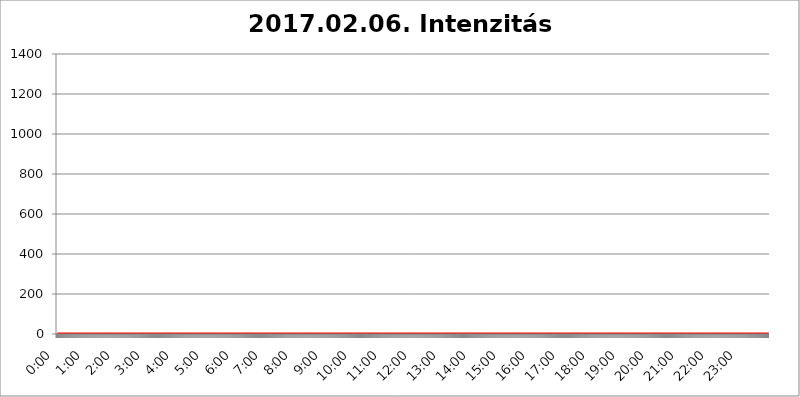
| Category | 2017.02.06. Intenzitás [W/m^2] |
|---|---|
| 0.0 | 0 |
| 0.0006944444444444445 | 0 |
| 0.001388888888888889 | 0 |
| 0.0020833333333333333 | 0 |
| 0.002777777777777778 | 0 |
| 0.003472222222222222 | 0 |
| 0.004166666666666667 | 0 |
| 0.004861111111111111 | 0 |
| 0.005555555555555556 | 0 |
| 0.0062499999999999995 | 0 |
| 0.006944444444444444 | 0 |
| 0.007638888888888889 | 0 |
| 0.008333333333333333 | 0 |
| 0.009027777777777779 | 0 |
| 0.009722222222222222 | 0 |
| 0.010416666666666666 | 0 |
| 0.011111111111111112 | 0 |
| 0.011805555555555555 | 0 |
| 0.012499999999999999 | 0 |
| 0.013194444444444444 | 0 |
| 0.013888888888888888 | 0 |
| 0.014583333333333332 | 0 |
| 0.015277777777777777 | 0 |
| 0.015972222222222224 | 0 |
| 0.016666666666666666 | 0 |
| 0.017361111111111112 | 0 |
| 0.018055555555555557 | 0 |
| 0.01875 | 0 |
| 0.019444444444444445 | 0 |
| 0.02013888888888889 | 0 |
| 0.020833333333333332 | 0 |
| 0.02152777777777778 | 0 |
| 0.022222222222222223 | 0 |
| 0.02291666666666667 | 0 |
| 0.02361111111111111 | 0 |
| 0.024305555555555556 | 0 |
| 0.024999999999999998 | 0 |
| 0.025694444444444447 | 0 |
| 0.02638888888888889 | 0 |
| 0.027083333333333334 | 0 |
| 0.027777777777777776 | 0 |
| 0.02847222222222222 | 0 |
| 0.029166666666666664 | 0 |
| 0.029861111111111113 | 0 |
| 0.030555555555555555 | 0 |
| 0.03125 | 0 |
| 0.03194444444444445 | 0 |
| 0.03263888888888889 | 0 |
| 0.03333333333333333 | 0 |
| 0.034027777777777775 | 0 |
| 0.034722222222222224 | 0 |
| 0.035416666666666666 | 0 |
| 0.036111111111111115 | 0 |
| 0.03680555555555556 | 0 |
| 0.0375 | 0 |
| 0.03819444444444444 | 0 |
| 0.03888888888888889 | 0 |
| 0.03958333333333333 | 0 |
| 0.04027777777777778 | 0 |
| 0.04097222222222222 | 0 |
| 0.041666666666666664 | 0 |
| 0.042361111111111106 | 0 |
| 0.04305555555555556 | 0 |
| 0.043750000000000004 | 0 |
| 0.044444444444444446 | 0 |
| 0.04513888888888889 | 0 |
| 0.04583333333333334 | 0 |
| 0.04652777777777778 | 0 |
| 0.04722222222222222 | 0 |
| 0.04791666666666666 | 0 |
| 0.04861111111111111 | 0 |
| 0.049305555555555554 | 0 |
| 0.049999999999999996 | 0 |
| 0.05069444444444445 | 0 |
| 0.051388888888888894 | 0 |
| 0.052083333333333336 | 0 |
| 0.05277777777777778 | 0 |
| 0.05347222222222222 | 0 |
| 0.05416666666666667 | 0 |
| 0.05486111111111111 | 0 |
| 0.05555555555555555 | 0 |
| 0.05625 | 0 |
| 0.05694444444444444 | 0 |
| 0.057638888888888885 | 0 |
| 0.05833333333333333 | 0 |
| 0.05902777777777778 | 0 |
| 0.059722222222222225 | 0 |
| 0.06041666666666667 | 0 |
| 0.061111111111111116 | 0 |
| 0.06180555555555556 | 0 |
| 0.0625 | 0 |
| 0.06319444444444444 | 0 |
| 0.06388888888888888 | 0 |
| 0.06458333333333334 | 0 |
| 0.06527777777777778 | 0 |
| 0.06597222222222222 | 0 |
| 0.06666666666666667 | 0 |
| 0.06736111111111111 | 0 |
| 0.06805555555555555 | 0 |
| 0.06874999999999999 | 0 |
| 0.06944444444444443 | 0 |
| 0.07013888888888889 | 0 |
| 0.07083333333333333 | 0 |
| 0.07152777777777779 | 0 |
| 0.07222222222222223 | 0 |
| 0.07291666666666667 | 0 |
| 0.07361111111111111 | 0 |
| 0.07430555555555556 | 0 |
| 0.075 | 0 |
| 0.07569444444444444 | 0 |
| 0.0763888888888889 | 0 |
| 0.07708333333333334 | 0 |
| 0.07777777777777778 | 0 |
| 0.07847222222222222 | 0 |
| 0.07916666666666666 | 0 |
| 0.0798611111111111 | 0 |
| 0.08055555555555556 | 0 |
| 0.08125 | 0 |
| 0.08194444444444444 | 0 |
| 0.08263888888888889 | 0 |
| 0.08333333333333333 | 0 |
| 0.08402777777777777 | 0 |
| 0.08472222222222221 | 0 |
| 0.08541666666666665 | 0 |
| 0.08611111111111112 | 0 |
| 0.08680555555555557 | 0 |
| 0.08750000000000001 | 0 |
| 0.08819444444444445 | 0 |
| 0.08888888888888889 | 0 |
| 0.08958333333333333 | 0 |
| 0.09027777777777778 | 0 |
| 0.09097222222222222 | 0 |
| 0.09166666666666667 | 0 |
| 0.09236111111111112 | 0 |
| 0.09305555555555556 | 0 |
| 0.09375 | 0 |
| 0.09444444444444444 | 0 |
| 0.09513888888888888 | 0 |
| 0.09583333333333333 | 0 |
| 0.09652777777777777 | 0 |
| 0.09722222222222222 | 0 |
| 0.09791666666666667 | 0 |
| 0.09861111111111111 | 0 |
| 0.09930555555555555 | 0 |
| 0.09999999999999999 | 0 |
| 0.10069444444444443 | 0 |
| 0.1013888888888889 | 0 |
| 0.10208333333333335 | 0 |
| 0.10277777777777779 | 0 |
| 0.10347222222222223 | 0 |
| 0.10416666666666667 | 0 |
| 0.10486111111111111 | 0 |
| 0.10555555555555556 | 0 |
| 0.10625 | 0 |
| 0.10694444444444444 | 0 |
| 0.1076388888888889 | 0 |
| 0.10833333333333334 | 0 |
| 0.10902777777777778 | 0 |
| 0.10972222222222222 | 0 |
| 0.1111111111111111 | 0 |
| 0.11180555555555556 | 0 |
| 0.11180555555555556 | 0 |
| 0.1125 | 0 |
| 0.11319444444444444 | 0 |
| 0.11388888888888889 | 0 |
| 0.11458333333333333 | 0 |
| 0.11527777777777777 | 0 |
| 0.11597222222222221 | 0 |
| 0.11666666666666665 | 0 |
| 0.1173611111111111 | 0 |
| 0.11805555555555557 | 0 |
| 0.11944444444444445 | 0 |
| 0.12013888888888889 | 0 |
| 0.12083333333333333 | 0 |
| 0.12152777777777778 | 0 |
| 0.12222222222222223 | 0 |
| 0.12291666666666667 | 0 |
| 0.12291666666666667 | 0 |
| 0.12361111111111112 | 0 |
| 0.12430555555555556 | 0 |
| 0.125 | 0 |
| 0.12569444444444444 | 0 |
| 0.12638888888888888 | 0 |
| 0.12708333333333333 | 0 |
| 0.16875 | 0 |
| 0.12847222222222224 | 0 |
| 0.12916666666666668 | 0 |
| 0.12986111111111112 | 0 |
| 0.13055555555555556 | 0 |
| 0.13125 | 0 |
| 0.13194444444444445 | 0 |
| 0.1326388888888889 | 0 |
| 0.13333333333333333 | 0 |
| 0.13402777777777777 | 0 |
| 0.13402777777777777 | 0 |
| 0.13472222222222222 | 0 |
| 0.13541666666666666 | 0 |
| 0.1361111111111111 | 0 |
| 0.13749999999999998 | 0 |
| 0.13819444444444443 | 0 |
| 0.1388888888888889 | 0 |
| 0.13958333333333334 | 0 |
| 0.14027777777777778 | 0 |
| 0.14097222222222222 | 0 |
| 0.14166666666666666 | 0 |
| 0.1423611111111111 | 0 |
| 0.14305555555555557 | 0 |
| 0.14375000000000002 | 0 |
| 0.14444444444444446 | 0 |
| 0.1451388888888889 | 0 |
| 0.1451388888888889 | 0 |
| 0.14652777777777778 | 0 |
| 0.14722222222222223 | 0 |
| 0.14791666666666667 | 0 |
| 0.1486111111111111 | 0 |
| 0.14930555555555555 | 0 |
| 0.15 | 0 |
| 0.15069444444444444 | 0 |
| 0.15138888888888888 | 0 |
| 0.15208333333333332 | 0 |
| 0.15277777777777776 | 0 |
| 0.15347222222222223 | 0 |
| 0.15416666666666667 | 0 |
| 0.15486111111111112 | 0 |
| 0.15555555555555556 | 0 |
| 0.15625 | 0 |
| 0.15694444444444444 | 0 |
| 0.15763888888888888 | 0 |
| 0.15833333333333333 | 0 |
| 0.15902777777777777 | 0 |
| 0.15972222222222224 | 0 |
| 0.16041666666666668 | 0 |
| 0.16111111111111112 | 0 |
| 0.16180555555555556 | 0 |
| 0.1625 | 0 |
| 0.16319444444444445 | 0 |
| 0.1638888888888889 | 0 |
| 0.16458333333333333 | 0 |
| 0.16527777777777777 | 0 |
| 0.16597222222222222 | 0 |
| 0.16666666666666666 | 0 |
| 0.1673611111111111 | 0 |
| 0.16805555555555554 | 0 |
| 0.16874999999999998 | 0 |
| 0.16944444444444443 | 0 |
| 0.17013888888888887 | 0 |
| 0.1708333333333333 | 0 |
| 0.17152777777777775 | 0 |
| 0.17222222222222225 | 0 |
| 0.1729166666666667 | 0 |
| 0.17361111111111113 | 0 |
| 0.17430555555555557 | 0 |
| 0.17500000000000002 | 0 |
| 0.17569444444444446 | 0 |
| 0.1763888888888889 | 0 |
| 0.17708333333333334 | 0 |
| 0.17777777777777778 | 0 |
| 0.17847222222222223 | 0 |
| 0.17916666666666667 | 0 |
| 0.1798611111111111 | 0 |
| 0.18055555555555555 | 0 |
| 0.18125 | 0 |
| 0.18194444444444444 | 0 |
| 0.1826388888888889 | 0 |
| 0.18333333333333335 | 0 |
| 0.1840277777777778 | 0 |
| 0.18472222222222223 | 0 |
| 0.18541666666666667 | 0 |
| 0.18611111111111112 | 0 |
| 0.18680555555555556 | 0 |
| 0.1875 | 0 |
| 0.18819444444444444 | 0 |
| 0.18888888888888888 | 0 |
| 0.18958333333333333 | 0 |
| 0.19027777777777777 | 0 |
| 0.1909722222222222 | 0 |
| 0.19166666666666665 | 0 |
| 0.19236111111111112 | 0 |
| 0.19305555555555554 | 0 |
| 0.19375 | 0 |
| 0.19444444444444445 | 0 |
| 0.1951388888888889 | 0 |
| 0.19583333333333333 | 0 |
| 0.19652777777777777 | 0 |
| 0.19722222222222222 | 0 |
| 0.19791666666666666 | 0 |
| 0.1986111111111111 | 0 |
| 0.19930555555555554 | 0 |
| 0.19999999999999998 | 0 |
| 0.20069444444444443 | 0 |
| 0.20138888888888887 | 0 |
| 0.2020833333333333 | 0 |
| 0.2027777777777778 | 0 |
| 0.2034722222222222 | 0 |
| 0.2041666666666667 | 0 |
| 0.20486111111111113 | 0 |
| 0.20555555555555557 | 0 |
| 0.20625000000000002 | 0 |
| 0.20694444444444446 | 0 |
| 0.2076388888888889 | 0 |
| 0.20833333333333334 | 0 |
| 0.20902777777777778 | 0 |
| 0.20972222222222223 | 0 |
| 0.21041666666666667 | 0 |
| 0.2111111111111111 | 0 |
| 0.21180555555555555 | 0 |
| 0.2125 | 0 |
| 0.21319444444444444 | 0 |
| 0.2138888888888889 | 0 |
| 0.21458333333333335 | 0 |
| 0.2152777777777778 | 0 |
| 0.21597222222222223 | 0 |
| 0.21666666666666667 | 0 |
| 0.21736111111111112 | 0 |
| 0.21805555555555556 | 0 |
| 0.21875 | 0 |
| 0.21944444444444444 | 0 |
| 0.22013888888888888 | 0 |
| 0.22083333333333333 | 0 |
| 0.22152777777777777 | 0 |
| 0.2222222222222222 | 0 |
| 0.22291666666666665 | 0 |
| 0.2236111111111111 | 0 |
| 0.22430555555555556 | 0 |
| 0.225 | 0 |
| 0.22569444444444445 | 0 |
| 0.2263888888888889 | 0 |
| 0.22708333333333333 | 0 |
| 0.22777777777777777 | 0 |
| 0.22847222222222222 | 0 |
| 0.22916666666666666 | 0 |
| 0.2298611111111111 | 0 |
| 0.23055555555555554 | 0 |
| 0.23124999999999998 | 0 |
| 0.23194444444444443 | 0 |
| 0.23263888888888887 | 0 |
| 0.2333333333333333 | 0 |
| 0.2340277777777778 | 0 |
| 0.2347222222222222 | 0 |
| 0.2354166666666667 | 0 |
| 0.23611111111111113 | 0 |
| 0.23680555555555557 | 0 |
| 0.23750000000000002 | 0 |
| 0.23819444444444446 | 0 |
| 0.2388888888888889 | 0 |
| 0.23958333333333334 | 0 |
| 0.24027777777777778 | 0 |
| 0.24097222222222223 | 0 |
| 0.24166666666666667 | 0 |
| 0.2423611111111111 | 0 |
| 0.24305555555555555 | 0 |
| 0.24375 | 0 |
| 0.24444444444444446 | 0 |
| 0.24513888888888888 | 0 |
| 0.24583333333333335 | 0 |
| 0.2465277777777778 | 0 |
| 0.24722222222222223 | 0 |
| 0.24791666666666667 | 0 |
| 0.24861111111111112 | 0 |
| 0.24930555555555556 | 0 |
| 0.25 | 0 |
| 0.25069444444444444 | 0 |
| 0.2513888888888889 | 0 |
| 0.2520833333333333 | 0 |
| 0.25277777777777777 | 0 |
| 0.2534722222222222 | 0 |
| 0.25416666666666665 | 0 |
| 0.2548611111111111 | 0 |
| 0.2555555555555556 | 0 |
| 0.25625000000000003 | 0 |
| 0.2569444444444445 | 0 |
| 0.2576388888888889 | 0 |
| 0.25833333333333336 | 0 |
| 0.2590277777777778 | 0 |
| 0.25972222222222224 | 0 |
| 0.2604166666666667 | 0 |
| 0.2611111111111111 | 0 |
| 0.26180555555555557 | 0 |
| 0.2625 | 0 |
| 0.26319444444444445 | 0 |
| 0.2638888888888889 | 0 |
| 0.26458333333333334 | 0 |
| 0.2652777777777778 | 0 |
| 0.2659722222222222 | 0 |
| 0.26666666666666666 | 0 |
| 0.2673611111111111 | 0 |
| 0.26805555555555555 | 0 |
| 0.26875 | 0 |
| 0.26944444444444443 | 0 |
| 0.2701388888888889 | 0 |
| 0.2708333333333333 | 0 |
| 0.27152777777777776 | 0 |
| 0.2722222222222222 | 0 |
| 0.27291666666666664 | 0 |
| 0.2736111111111111 | 0 |
| 0.2743055555555555 | 0 |
| 0.27499999999999997 | 0 |
| 0.27569444444444446 | 0 |
| 0.27638888888888885 | 0 |
| 0.27708333333333335 | 0 |
| 0.2777777777777778 | 0 |
| 0.27847222222222223 | 0 |
| 0.2791666666666667 | 0 |
| 0.2798611111111111 | 0 |
| 0.28055555555555556 | 0 |
| 0.28125 | 0 |
| 0.28194444444444444 | 0 |
| 0.2826388888888889 | 0 |
| 0.2833333333333333 | 0 |
| 0.28402777777777777 | 0 |
| 0.2847222222222222 | 0 |
| 0.28541666666666665 | 0 |
| 0.28611111111111115 | 0 |
| 0.28680555555555554 | 0 |
| 0.28750000000000003 | 0 |
| 0.2881944444444445 | 0 |
| 0.2888888888888889 | 0 |
| 0.28958333333333336 | 0 |
| 0.2902777777777778 | 0 |
| 0.29097222222222224 | 0 |
| 0.2916666666666667 | 0 |
| 0.2923611111111111 | 0 |
| 0.29305555555555557 | 0 |
| 0.29375 | 0 |
| 0.29444444444444445 | 0 |
| 0.2951388888888889 | 0 |
| 0.29583333333333334 | 0 |
| 0.2965277777777778 | 0 |
| 0.2972222222222222 | 0 |
| 0.29791666666666666 | 0 |
| 0.2986111111111111 | 0 |
| 0.29930555555555555 | 0 |
| 0.3 | 0 |
| 0.30069444444444443 | 0 |
| 0.3013888888888889 | 0 |
| 0.3020833333333333 | 0 |
| 0.30277777777777776 | 0 |
| 0.3034722222222222 | 0 |
| 0.30416666666666664 | 0 |
| 0.3048611111111111 | 0 |
| 0.3055555555555555 | 0 |
| 0.30624999999999997 | 0 |
| 0.3069444444444444 | 0 |
| 0.3076388888888889 | 0 |
| 0.30833333333333335 | 0 |
| 0.3090277777777778 | 0 |
| 0.30972222222222223 | 0 |
| 0.3104166666666667 | 0 |
| 0.3111111111111111 | 0 |
| 0.31180555555555556 | 0 |
| 0.3125 | 0 |
| 0.31319444444444444 | 0 |
| 0.3138888888888889 | 0 |
| 0.3145833333333333 | 0 |
| 0.31527777777777777 | 0 |
| 0.3159722222222222 | 0 |
| 0.31666666666666665 | 0 |
| 0.31736111111111115 | 0 |
| 0.31805555555555554 | 0 |
| 0.31875000000000003 | 0 |
| 0.3194444444444445 | 0 |
| 0.3201388888888889 | 0 |
| 0.32083333333333336 | 0 |
| 0.3215277777777778 | 0 |
| 0.32222222222222224 | 0 |
| 0.3229166666666667 | 0 |
| 0.3236111111111111 | 0 |
| 0.32430555555555557 | 0 |
| 0.325 | 0 |
| 0.32569444444444445 | 0 |
| 0.3263888888888889 | 0 |
| 0.32708333333333334 | 0 |
| 0.3277777777777778 | 0 |
| 0.3284722222222222 | 0 |
| 0.32916666666666666 | 0 |
| 0.3298611111111111 | 0 |
| 0.33055555555555555 | 0 |
| 0.33125 | 0 |
| 0.33194444444444443 | 0 |
| 0.3326388888888889 | 0 |
| 0.3333333333333333 | 0 |
| 0.3340277777777778 | 0 |
| 0.3347222222222222 | 0 |
| 0.3354166666666667 | 0 |
| 0.3361111111111111 | 0 |
| 0.3368055555555556 | 0 |
| 0.33749999999999997 | 0 |
| 0.33819444444444446 | 0 |
| 0.33888888888888885 | 0 |
| 0.33958333333333335 | 0 |
| 0.34027777777777773 | 0 |
| 0.34097222222222223 | 0 |
| 0.3416666666666666 | 0 |
| 0.3423611111111111 | 0 |
| 0.3430555555555555 | 0 |
| 0.34375 | 0 |
| 0.3444444444444445 | 0 |
| 0.3451388888888889 | 0 |
| 0.3458333333333334 | 0 |
| 0.34652777777777777 | 0 |
| 0.34722222222222227 | 0 |
| 0.34791666666666665 | 0 |
| 0.34861111111111115 | 0 |
| 0.34930555555555554 | 0 |
| 0.35000000000000003 | 0 |
| 0.3506944444444444 | 0 |
| 0.3513888888888889 | 0 |
| 0.3520833333333333 | 0 |
| 0.3527777777777778 | 0 |
| 0.3534722222222222 | 0 |
| 0.3541666666666667 | 0 |
| 0.3548611111111111 | 0 |
| 0.35555555555555557 | 0 |
| 0.35625 | 0 |
| 0.35694444444444445 | 0 |
| 0.3576388888888889 | 0 |
| 0.35833333333333334 | 0 |
| 0.3590277777777778 | 0 |
| 0.3597222222222222 | 0 |
| 0.36041666666666666 | 0 |
| 0.3611111111111111 | 0 |
| 0.36180555555555555 | 0 |
| 0.3625 | 0 |
| 0.36319444444444443 | 0 |
| 0.3638888888888889 | 0 |
| 0.3645833333333333 | 0 |
| 0.3652777777777778 | 0 |
| 0.3659722222222222 | 0 |
| 0.3666666666666667 | 0 |
| 0.3673611111111111 | 0 |
| 0.3680555555555556 | 0 |
| 0.36874999999999997 | 0 |
| 0.36944444444444446 | 0 |
| 0.37013888888888885 | 0 |
| 0.37083333333333335 | 0 |
| 0.37152777777777773 | 0 |
| 0.37222222222222223 | 0 |
| 0.3729166666666666 | 0 |
| 0.3736111111111111 | 0 |
| 0.3743055555555555 | 0 |
| 0.375 | 0 |
| 0.3756944444444445 | 0 |
| 0.3763888888888889 | 0 |
| 0.3770833333333334 | 0 |
| 0.37777777777777777 | 0 |
| 0.37847222222222227 | 0 |
| 0.37916666666666665 | 0 |
| 0.37986111111111115 | 0 |
| 0.38055555555555554 | 0 |
| 0.38125000000000003 | 0 |
| 0.3819444444444444 | 0 |
| 0.3826388888888889 | 0 |
| 0.3833333333333333 | 0 |
| 0.3840277777777778 | 0 |
| 0.3847222222222222 | 0 |
| 0.3854166666666667 | 0 |
| 0.3861111111111111 | 0 |
| 0.38680555555555557 | 0 |
| 0.3875 | 0 |
| 0.38819444444444445 | 0 |
| 0.3888888888888889 | 0 |
| 0.38958333333333334 | 0 |
| 0.3902777777777778 | 0 |
| 0.3909722222222222 | 0 |
| 0.39166666666666666 | 0 |
| 0.3923611111111111 | 0 |
| 0.39305555555555555 | 0 |
| 0.39375 | 0 |
| 0.39444444444444443 | 0 |
| 0.3951388888888889 | 0 |
| 0.3958333333333333 | 0 |
| 0.3965277777777778 | 0 |
| 0.3972222222222222 | 0 |
| 0.3979166666666667 | 0 |
| 0.3986111111111111 | 0 |
| 0.3993055555555556 | 0 |
| 0.39999999999999997 | 0 |
| 0.40069444444444446 | 0 |
| 0.40138888888888885 | 0 |
| 0.40208333333333335 | 0 |
| 0.40277777777777773 | 0 |
| 0.40347222222222223 | 0 |
| 0.4041666666666666 | 0 |
| 0.4048611111111111 | 0 |
| 0.4055555555555555 | 0 |
| 0.40625 | 0 |
| 0.4069444444444445 | 0 |
| 0.4076388888888889 | 0 |
| 0.4083333333333334 | 0 |
| 0.40902777777777777 | 0 |
| 0.40972222222222227 | 0 |
| 0.41041666666666665 | 0 |
| 0.41111111111111115 | 0 |
| 0.41180555555555554 | 0 |
| 0.41250000000000003 | 0 |
| 0.4131944444444444 | 0 |
| 0.4138888888888889 | 0 |
| 0.4145833333333333 | 0 |
| 0.4152777777777778 | 0 |
| 0.4159722222222222 | 0 |
| 0.4166666666666667 | 0 |
| 0.4173611111111111 | 0 |
| 0.41805555555555557 | 0 |
| 0.41875 | 0 |
| 0.41944444444444445 | 0 |
| 0.4201388888888889 | 0 |
| 0.42083333333333334 | 0 |
| 0.4215277777777778 | 0 |
| 0.4222222222222222 | 0 |
| 0.42291666666666666 | 0 |
| 0.4236111111111111 | 0 |
| 0.42430555555555555 | 0 |
| 0.425 | 0 |
| 0.42569444444444443 | 0 |
| 0.4263888888888889 | 0 |
| 0.4270833333333333 | 0 |
| 0.4277777777777778 | 0 |
| 0.4284722222222222 | 0 |
| 0.4291666666666667 | 0 |
| 0.4298611111111111 | 0 |
| 0.4305555555555556 | 0 |
| 0.43124999999999997 | 0 |
| 0.43194444444444446 | 0 |
| 0.43263888888888885 | 0 |
| 0.43333333333333335 | 0 |
| 0.43402777777777773 | 0 |
| 0.43472222222222223 | 0 |
| 0.4354166666666666 | 0 |
| 0.4361111111111111 | 0 |
| 0.4368055555555555 | 0 |
| 0.4375 | 0 |
| 0.4381944444444445 | 0 |
| 0.4388888888888889 | 0 |
| 0.4395833333333334 | 0 |
| 0.44027777777777777 | 0 |
| 0.44097222222222227 | 0 |
| 0.44166666666666665 | 0 |
| 0.44236111111111115 | 0 |
| 0.44305555555555554 | 0 |
| 0.44375000000000003 | 0 |
| 0.4444444444444444 | 0 |
| 0.4451388888888889 | 0 |
| 0.4458333333333333 | 0 |
| 0.4465277777777778 | 0 |
| 0.4472222222222222 | 0 |
| 0.4479166666666667 | 0 |
| 0.4486111111111111 | 0 |
| 0.44930555555555557 | 0 |
| 0.45 | 0 |
| 0.45069444444444445 | 0 |
| 0.4513888888888889 | 0 |
| 0.45208333333333334 | 0 |
| 0.4527777777777778 | 0 |
| 0.4534722222222222 | 0 |
| 0.45416666666666666 | 0 |
| 0.4548611111111111 | 0 |
| 0.45555555555555555 | 0 |
| 0.45625 | 0 |
| 0.45694444444444443 | 0 |
| 0.4576388888888889 | 0 |
| 0.4583333333333333 | 0 |
| 0.4590277777777778 | 0 |
| 0.4597222222222222 | 0 |
| 0.4604166666666667 | 0 |
| 0.4611111111111111 | 0 |
| 0.4618055555555556 | 0 |
| 0.46249999999999997 | 0 |
| 0.46319444444444446 | 0 |
| 0.46388888888888885 | 0 |
| 0.46458333333333335 | 0 |
| 0.46527777777777773 | 0 |
| 0.46597222222222223 | 0 |
| 0.4666666666666666 | 0 |
| 0.4673611111111111 | 0 |
| 0.4680555555555555 | 0 |
| 0.46875 | 0 |
| 0.4694444444444445 | 0 |
| 0.4701388888888889 | 0 |
| 0.4708333333333334 | 0 |
| 0.47152777777777777 | 0 |
| 0.47222222222222227 | 0 |
| 0.47291666666666665 | 0 |
| 0.47361111111111115 | 0 |
| 0.47430555555555554 | 0 |
| 0.47500000000000003 | 0 |
| 0.4756944444444444 | 0 |
| 0.4763888888888889 | 0 |
| 0.4770833333333333 | 0 |
| 0.4777777777777778 | 0 |
| 0.4784722222222222 | 0 |
| 0.4791666666666667 | 0 |
| 0.4798611111111111 | 0 |
| 0.48055555555555557 | 0 |
| 0.48125 | 0 |
| 0.48194444444444445 | 0 |
| 0.4826388888888889 | 0 |
| 0.48333333333333334 | 0 |
| 0.4840277777777778 | 0 |
| 0.4847222222222222 | 0 |
| 0.48541666666666666 | 0 |
| 0.4861111111111111 | 0 |
| 0.48680555555555555 | 0 |
| 0.4875 | 0 |
| 0.48819444444444443 | 0 |
| 0.4888888888888889 | 0 |
| 0.4895833333333333 | 0 |
| 0.4902777777777778 | 0 |
| 0.4909722222222222 | 0 |
| 0.4916666666666667 | 0 |
| 0.4923611111111111 | 0 |
| 0.4930555555555556 | 0 |
| 0.49374999999999997 | 0 |
| 0.49444444444444446 | 0 |
| 0.49513888888888885 | 0 |
| 0.49583333333333335 | 0 |
| 0.49652777777777773 | 0 |
| 0.49722222222222223 | 0 |
| 0.4979166666666666 | 0 |
| 0.4986111111111111 | 0 |
| 0.4993055555555555 | 0 |
| 0.5 | 0 |
| 0.5006944444444444 | 0 |
| 0.5013888888888889 | 0 |
| 0.5020833333333333 | 0 |
| 0.5027777777777778 | 0 |
| 0.5034722222222222 | 0 |
| 0.5041666666666667 | 0 |
| 0.5048611111111111 | 0 |
| 0.5055555555555555 | 0 |
| 0.50625 | 0 |
| 0.5069444444444444 | 0 |
| 0.5076388888888889 | 0 |
| 0.5083333333333333 | 0 |
| 0.5090277777777777 | 0 |
| 0.5097222222222222 | 0 |
| 0.5104166666666666 | 0 |
| 0.5111111111111112 | 0 |
| 0.5118055555555555 | 0 |
| 0.5125000000000001 | 0 |
| 0.5131944444444444 | 0 |
| 0.513888888888889 | 0 |
| 0.5145833333333333 | 0 |
| 0.5152777777777778 | 0 |
| 0.5159722222222222 | 0 |
| 0.5166666666666667 | 0 |
| 0.517361111111111 | 0 |
| 0.5180555555555556 | 0 |
| 0.5187499999999999 | 0 |
| 0.5194444444444445 | 0 |
| 0.5201388888888888 | 0 |
| 0.5208333333333334 | 0 |
| 0.5215277777777778 | 0 |
| 0.5222222222222223 | 0 |
| 0.5229166666666667 | 0 |
| 0.5236111111111111 | 0 |
| 0.5243055555555556 | 0 |
| 0.525 | 0 |
| 0.5256944444444445 | 0 |
| 0.5263888888888889 | 0 |
| 0.5270833333333333 | 0 |
| 0.5277777777777778 | 0 |
| 0.5284722222222222 | 0 |
| 0.5291666666666667 | 0 |
| 0.5298611111111111 | 0 |
| 0.5305555555555556 | 0 |
| 0.53125 | 0 |
| 0.5319444444444444 | 0 |
| 0.5326388888888889 | 0 |
| 0.5333333333333333 | 0 |
| 0.5340277777777778 | 0 |
| 0.5347222222222222 | 0 |
| 0.5354166666666667 | 0 |
| 0.5361111111111111 | 0 |
| 0.5368055555555555 | 0 |
| 0.5375 | 0 |
| 0.5381944444444444 | 0 |
| 0.5388888888888889 | 0 |
| 0.5395833333333333 | 0 |
| 0.5402777777777777 | 0 |
| 0.5409722222222222 | 0 |
| 0.5416666666666666 | 0 |
| 0.5423611111111112 | 0 |
| 0.5430555555555555 | 0 |
| 0.5437500000000001 | 0 |
| 0.5444444444444444 | 0 |
| 0.545138888888889 | 0 |
| 0.5458333333333333 | 0 |
| 0.5465277777777778 | 0 |
| 0.5472222222222222 | 0 |
| 0.5479166666666667 | 0 |
| 0.548611111111111 | 0 |
| 0.5493055555555556 | 0 |
| 0.5499999999999999 | 0 |
| 0.5506944444444445 | 0 |
| 0.5513888888888888 | 0 |
| 0.5520833333333334 | 0 |
| 0.5527777777777778 | 0 |
| 0.5534722222222223 | 0 |
| 0.5541666666666667 | 0 |
| 0.5548611111111111 | 0 |
| 0.5555555555555556 | 0 |
| 0.55625 | 0 |
| 0.5569444444444445 | 0 |
| 0.5576388888888889 | 0 |
| 0.5583333333333333 | 0 |
| 0.5590277777777778 | 0 |
| 0.5597222222222222 | 0 |
| 0.5604166666666667 | 0 |
| 0.5611111111111111 | 0 |
| 0.5618055555555556 | 0 |
| 0.5625 | 0 |
| 0.5631944444444444 | 0 |
| 0.5638888888888889 | 0 |
| 0.5645833333333333 | 0 |
| 0.5652777777777778 | 0 |
| 0.5659722222222222 | 0 |
| 0.5666666666666667 | 0 |
| 0.5673611111111111 | 0 |
| 0.5680555555555555 | 0 |
| 0.56875 | 0 |
| 0.5694444444444444 | 0 |
| 0.5701388888888889 | 0 |
| 0.5708333333333333 | 0 |
| 0.5715277777777777 | 0 |
| 0.5722222222222222 | 0 |
| 0.5729166666666666 | 0 |
| 0.5736111111111112 | 0 |
| 0.5743055555555555 | 0 |
| 0.5750000000000001 | 0 |
| 0.5756944444444444 | 0 |
| 0.576388888888889 | 0 |
| 0.5770833333333333 | 0 |
| 0.5777777777777778 | 0 |
| 0.5784722222222222 | 0 |
| 0.5791666666666667 | 0 |
| 0.579861111111111 | 0 |
| 0.5805555555555556 | 0 |
| 0.5812499999999999 | 0 |
| 0.5819444444444445 | 0 |
| 0.5826388888888888 | 0 |
| 0.5833333333333334 | 0 |
| 0.5840277777777778 | 0 |
| 0.5847222222222223 | 0 |
| 0.5854166666666667 | 0 |
| 0.5861111111111111 | 0 |
| 0.5868055555555556 | 0 |
| 0.5875 | 0 |
| 0.5881944444444445 | 0 |
| 0.5888888888888889 | 0 |
| 0.5895833333333333 | 0 |
| 0.5902777777777778 | 0 |
| 0.5909722222222222 | 0 |
| 0.5916666666666667 | 0 |
| 0.5923611111111111 | 0 |
| 0.5930555555555556 | 0 |
| 0.59375 | 0 |
| 0.5944444444444444 | 0 |
| 0.5951388888888889 | 0 |
| 0.5958333333333333 | 0 |
| 0.5965277777777778 | 0 |
| 0.5972222222222222 | 0 |
| 0.5979166666666667 | 0 |
| 0.5986111111111111 | 0 |
| 0.5993055555555555 | 0 |
| 0.6 | 0 |
| 0.6006944444444444 | 0 |
| 0.6013888888888889 | 0 |
| 0.6020833333333333 | 0 |
| 0.6027777777777777 | 0 |
| 0.6034722222222222 | 0 |
| 0.6041666666666666 | 0 |
| 0.6048611111111112 | 0 |
| 0.6055555555555555 | 0 |
| 0.6062500000000001 | 0 |
| 0.6069444444444444 | 0 |
| 0.607638888888889 | 0 |
| 0.6083333333333333 | 0 |
| 0.6090277777777778 | 0 |
| 0.6097222222222222 | 0 |
| 0.6104166666666667 | 0 |
| 0.611111111111111 | 0 |
| 0.6118055555555556 | 0 |
| 0.6124999999999999 | 0 |
| 0.6131944444444445 | 0 |
| 0.6138888888888888 | 0 |
| 0.6145833333333334 | 0 |
| 0.6152777777777778 | 0 |
| 0.6159722222222223 | 0 |
| 0.6166666666666667 | 0 |
| 0.6173611111111111 | 0 |
| 0.6180555555555556 | 0 |
| 0.61875 | 0 |
| 0.6194444444444445 | 0 |
| 0.6201388888888889 | 0 |
| 0.6208333333333333 | 0 |
| 0.6215277777777778 | 0 |
| 0.6222222222222222 | 0 |
| 0.6229166666666667 | 0 |
| 0.6236111111111111 | 0 |
| 0.6243055555555556 | 0 |
| 0.625 | 0 |
| 0.6256944444444444 | 0 |
| 0.6263888888888889 | 0 |
| 0.6270833333333333 | 0 |
| 0.6277777777777778 | 0 |
| 0.6284722222222222 | 0 |
| 0.6291666666666667 | 0 |
| 0.6298611111111111 | 0 |
| 0.6305555555555555 | 0 |
| 0.63125 | 0 |
| 0.6319444444444444 | 0 |
| 0.6326388888888889 | 0 |
| 0.6333333333333333 | 0 |
| 0.6340277777777777 | 0 |
| 0.6347222222222222 | 0 |
| 0.6354166666666666 | 0 |
| 0.6361111111111112 | 0 |
| 0.6368055555555555 | 0 |
| 0.6375000000000001 | 0 |
| 0.6381944444444444 | 0 |
| 0.638888888888889 | 0 |
| 0.6395833333333333 | 0 |
| 0.6402777777777778 | 0 |
| 0.6409722222222222 | 0 |
| 0.6416666666666667 | 0 |
| 0.642361111111111 | 0 |
| 0.6430555555555556 | 0 |
| 0.6437499999999999 | 0 |
| 0.6444444444444445 | 0 |
| 0.6451388888888888 | 0 |
| 0.6458333333333334 | 0 |
| 0.6465277777777778 | 0 |
| 0.6472222222222223 | 0 |
| 0.6479166666666667 | 0 |
| 0.6486111111111111 | 0 |
| 0.6493055555555556 | 0 |
| 0.65 | 0 |
| 0.6506944444444445 | 0 |
| 0.6513888888888889 | 0 |
| 0.6520833333333333 | 0 |
| 0.6527777777777778 | 0 |
| 0.6534722222222222 | 0 |
| 0.6541666666666667 | 0 |
| 0.6548611111111111 | 0 |
| 0.6555555555555556 | 0 |
| 0.65625 | 0 |
| 0.6569444444444444 | 0 |
| 0.6576388888888889 | 0 |
| 0.6583333333333333 | 0 |
| 0.6590277777777778 | 0 |
| 0.6597222222222222 | 0 |
| 0.6604166666666667 | 0 |
| 0.6611111111111111 | 0 |
| 0.6618055555555555 | 0 |
| 0.6625 | 0 |
| 0.6631944444444444 | 0 |
| 0.6638888888888889 | 0 |
| 0.6645833333333333 | 0 |
| 0.6652777777777777 | 0 |
| 0.6659722222222222 | 0 |
| 0.6666666666666666 | 0 |
| 0.6673611111111111 | 0 |
| 0.6680555555555556 | 0 |
| 0.6687500000000001 | 0 |
| 0.6694444444444444 | 0 |
| 0.6701388888888888 | 0 |
| 0.6708333333333334 | 0 |
| 0.6715277777777778 | 0 |
| 0.6722222222222222 | 0 |
| 0.6729166666666666 | 0 |
| 0.6736111111111112 | 0 |
| 0.6743055555555556 | 0 |
| 0.6749999999999999 | 0 |
| 0.6756944444444444 | 0 |
| 0.6763888888888889 | 0 |
| 0.6770833333333334 | 0 |
| 0.6777777777777777 | 0 |
| 0.6784722222222223 | 0 |
| 0.6791666666666667 | 0 |
| 0.6798611111111111 | 0 |
| 0.6805555555555555 | 0 |
| 0.68125 | 0 |
| 0.6819444444444445 | 0 |
| 0.6826388888888889 | 0 |
| 0.6833333333333332 | 0 |
| 0.6840277777777778 | 0 |
| 0.6847222222222222 | 0 |
| 0.6854166666666667 | 0 |
| 0.686111111111111 | 0 |
| 0.6868055555555556 | 0 |
| 0.6875 | 0 |
| 0.6881944444444444 | 0 |
| 0.688888888888889 | 0 |
| 0.6895833333333333 | 0 |
| 0.6902777777777778 | 0 |
| 0.6909722222222222 | 0 |
| 0.6916666666666668 | 0 |
| 0.6923611111111111 | 0 |
| 0.6930555555555555 | 0 |
| 0.69375 | 0 |
| 0.6944444444444445 | 0 |
| 0.6951388888888889 | 0 |
| 0.6958333333333333 | 0 |
| 0.6965277777777777 | 0 |
| 0.6972222222222223 | 0 |
| 0.6979166666666666 | 0 |
| 0.6986111111111111 | 0 |
| 0.6993055555555556 | 0 |
| 0.7000000000000001 | 0 |
| 0.7006944444444444 | 0 |
| 0.7013888888888888 | 0 |
| 0.7020833333333334 | 0 |
| 0.7027777777777778 | 0 |
| 0.7034722222222222 | 0 |
| 0.7041666666666666 | 0 |
| 0.7048611111111112 | 0 |
| 0.7055555555555556 | 0 |
| 0.7062499999999999 | 0 |
| 0.7069444444444444 | 0 |
| 0.7076388888888889 | 0 |
| 0.7083333333333334 | 0 |
| 0.7090277777777777 | 0 |
| 0.7097222222222223 | 0 |
| 0.7104166666666667 | 0 |
| 0.7111111111111111 | 0 |
| 0.7118055555555555 | 0 |
| 0.7125 | 0 |
| 0.7131944444444445 | 0 |
| 0.7138888888888889 | 0 |
| 0.7145833333333332 | 0 |
| 0.7152777777777778 | 0 |
| 0.7159722222222222 | 0 |
| 0.7166666666666667 | 0 |
| 0.717361111111111 | 0 |
| 0.7180555555555556 | 0 |
| 0.71875 | 0 |
| 0.7194444444444444 | 0 |
| 0.720138888888889 | 0 |
| 0.7208333333333333 | 0 |
| 0.7215277777777778 | 0 |
| 0.7222222222222222 | 0 |
| 0.7229166666666668 | 0 |
| 0.7236111111111111 | 0 |
| 0.7243055555555555 | 0 |
| 0.725 | 0 |
| 0.7256944444444445 | 0 |
| 0.7263888888888889 | 0 |
| 0.7270833333333333 | 0 |
| 0.7277777777777777 | 0 |
| 0.7284722222222223 | 0 |
| 0.7291666666666666 | 0 |
| 0.7298611111111111 | 0 |
| 0.7305555555555556 | 0 |
| 0.7312500000000001 | 0 |
| 0.7319444444444444 | 0 |
| 0.7326388888888888 | 0 |
| 0.7333333333333334 | 0 |
| 0.7340277777777778 | 0 |
| 0.7347222222222222 | 0 |
| 0.7354166666666666 | 0 |
| 0.7361111111111112 | 0 |
| 0.7368055555555556 | 0 |
| 0.7374999999999999 | 0 |
| 0.7381944444444444 | 0 |
| 0.7388888888888889 | 0 |
| 0.7395833333333334 | 0 |
| 0.7402777777777777 | 0 |
| 0.7409722222222223 | 0 |
| 0.7416666666666667 | 0 |
| 0.7423611111111111 | 0 |
| 0.7430555555555555 | 0 |
| 0.74375 | 0 |
| 0.7444444444444445 | 0 |
| 0.7451388888888889 | 0 |
| 0.7458333333333332 | 0 |
| 0.7465277777777778 | 0 |
| 0.7472222222222222 | 0 |
| 0.7479166666666667 | 0 |
| 0.748611111111111 | 0 |
| 0.7493055555555556 | 0 |
| 0.75 | 0 |
| 0.7506944444444444 | 0 |
| 0.751388888888889 | 0 |
| 0.7520833333333333 | 0 |
| 0.7527777777777778 | 0 |
| 0.7534722222222222 | 0 |
| 0.7541666666666668 | 0 |
| 0.7548611111111111 | 0 |
| 0.7555555555555555 | 0 |
| 0.75625 | 0 |
| 0.7569444444444445 | 0 |
| 0.7576388888888889 | 0 |
| 0.7583333333333333 | 0 |
| 0.7590277777777777 | 0 |
| 0.7597222222222223 | 0 |
| 0.7604166666666666 | 0 |
| 0.7611111111111111 | 0 |
| 0.7618055555555556 | 0 |
| 0.7625000000000001 | 0 |
| 0.7631944444444444 | 0 |
| 0.7638888888888888 | 0 |
| 0.7645833333333334 | 0 |
| 0.7652777777777778 | 0 |
| 0.7659722222222222 | 0 |
| 0.7666666666666666 | 0 |
| 0.7673611111111112 | 0 |
| 0.7680555555555556 | 0 |
| 0.7687499999999999 | 0 |
| 0.7694444444444444 | 0 |
| 0.7701388888888889 | 0 |
| 0.7708333333333334 | 0 |
| 0.7715277777777777 | 0 |
| 0.7722222222222223 | 0 |
| 0.7729166666666667 | 0 |
| 0.7736111111111111 | 0 |
| 0.7743055555555555 | 0 |
| 0.775 | 0 |
| 0.7756944444444445 | 0 |
| 0.7763888888888889 | 0 |
| 0.7770833333333332 | 0 |
| 0.7777777777777778 | 0 |
| 0.7784722222222222 | 0 |
| 0.7791666666666667 | 0 |
| 0.779861111111111 | 0 |
| 0.7805555555555556 | 0 |
| 0.78125 | 0 |
| 0.7819444444444444 | 0 |
| 0.782638888888889 | 0 |
| 0.7833333333333333 | 0 |
| 0.7840277777777778 | 0 |
| 0.7847222222222222 | 0 |
| 0.7854166666666668 | 0 |
| 0.7861111111111111 | 0 |
| 0.7868055555555555 | 0 |
| 0.7875 | 0 |
| 0.7881944444444445 | 0 |
| 0.7888888888888889 | 0 |
| 0.7895833333333333 | 0 |
| 0.7902777777777777 | 0 |
| 0.7909722222222223 | 0 |
| 0.7916666666666666 | 0 |
| 0.7923611111111111 | 0 |
| 0.7930555555555556 | 0 |
| 0.7937500000000001 | 0 |
| 0.7944444444444444 | 0 |
| 0.7951388888888888 | 0 |
| 0.7958333333333334 | 0 |
| 0.7965277777777778 | 0 |
| 0.7972222222222222 | 0 |
| 0.7979166666666666 | 0 |
| 0.7986111111111112 | 0 |
| 0.7993055555555556 | 0 |
| 0.7999999999999999 | 0 |
| 0.8006944444444444 | 0 |
| 0.8013888888888889 | 0 |
| 0.8020833333333334 | 0 |
| 0.8027777777777777 | 0 |
| 0.8034722222222223 | 0 |
| 0.8041666666666667 | 0 |
| 0.8048611111111111 | 0 |
| 0.8055555555555555 | 0 |
| 0.80625 | 0 |
| 0.8069444444444445 | 0 |
| 0.8076388888888889 | 0 |
| 0.8083333333333332 | 0 |
| 0.8090277777777778 | 0 |
| 0.8097222222222222 | 0 |
| 0.8104166666666667 | 0 |
| 0.811111111111111 | 0 |
| 0.8118055555555556 | 0 |
| 0.8125 | 0 |
| 0.8131944444444444 | 0 |
| 0.813888888888889 | 0 |
| 0.8145833333333333 | 0 |
| 0.8152777777777778 | 0 |
| 0.8159722222222222 | 0 |
| 0.8166666666666668 | 0 |
| 0.8173611111111111 | 0 |
| 0.8180555555555555 | 0 |
| 0.81875 | 0 |
| 0.8194444444444445 | 0 |
| 0.8201388888888889 | 0 |
| 0.8208333333333333 | 0 |
| 0.8215277777777777 | 0 |
| 0.8222222222222223 | 0 |
| 0.8229166666666666 | 0 |
| 0.8236111111111111 | 0 |
| 0.8243055555555556 | 0 |
| 0.8250000000000001 | 0 |
| 0.8256944444444444 | 0 |
| 0.8263888888888888 | 0 |
| 0.8270833333333334 | 0 |
| 0.8277777777777778 | 0 |
| 0.8284722222222222 | 0 |
| 0.8291666666666666 | 0 |
| 0.8298611111111112 | 0 |
| 0.8305555555555556 | 0 |
| 0.8312499999999999 | 0 |
| 0.8319444444444444 | 0 |
| 0.8326388888888889 | 0 |
| 0.8333333333333334 | 0 |
| 0.8340277777777777 | 0 |
| 0.8347222222222223 | 0 |
| 0.8354166666666667 | 0 |
| 0.8361111111111111 | 0 |
| 0.8368055555555555 | 0 |
| 0.8375 | 0 |
| 0.8381944444444445 | 0 |
| 0.8388888888888889 | 0 |
| 0.8395833333333332 | 0 |
| 0.8402777777777778 | 0 |
| 0.8409722222222222 | 0 |
| 0.8416666666666667 | 0 |
| 0.842361111111111 | 0 |
| 0.8430555555555556 | 0 |
| 0.84375 | 0 |
| 0.8444444444444444 | 0 |
| 0.845138888888889 | 0 |
| 0.8458333333333333 | 0 |
| 0.8465277777777778 | 0 |
| 0.8472222222222222 | 0 |
| 0.8479166666666668 | 0 |
| 0.8486111111111111 | 0 |
| 0.8493055555555555 | 0 |
| 0.85 | 0 |
| 0.8506944444444445 | 0 |
| 0.8513888888888889 | 0 |
| 0.8520833333333333 | 0 |
| 0.8527777777777777 | 0 |
| 0.8534722222222223 | 0 |
| 0.8541666666666666 | 0 |
| 0.8548611111111111 | 0 |
| 0.8555555555555556 | 0 |
| 0.8562500000000001 | 0 |
| 0.8569444444444444 | 0 |
| 0.8576388888888888 | 0 |
| 0.8583333333333334 | 0 |
| 0.8590277777777778 | 0 |
| 0.8597222222222222 | 0 |
| 0.8604166666666666 | 0 |
| 0.8611111111111112 | 0 |
| 0.8618055555555556 | 0 |
| 0.8624999999999999 | 0 |
| 0.8631944444444444 | 0 |
| 0.8638888888888889 | 0 |
| 0.8645833333333334 | 0 |
| 0.8652777777777777 | 0 |
| 0.8659722222222223 | 0 |
| 0.8666666666666667 | 0 |
| 0.8673611111111111 | 0 |
| 0.8680555555555555 | 0 |
| 0.86875 | 0 |
| 0.8694444444444445 | 0 |
| 0.8701388888888889 | 0 |
| 0.8708333333333332 | 0 |
| 0.8715277777777778 | 0 |
| 0.8722222222222222 | 0 |
| 0.8729166666666667 | 0 |
| 0.873611111111111 | 0 |
| 0.8743055555555556 | 0 |
| 0.875 | 0 |
| 0.8756944444444444 | 0 |
| 0.876388888888889 | 0 |
| 0.8770833333333333 | 0 |
| 0.8777777777777778 | 0 |
| 0.8784722222222222 | 0 |
| 0.8791666666666668 | 0 |
| 0.8798611111111111 | 0 |
| 0.8805555555555555 | 0 |
| 0.88125 | 0 |
| 0.8819444444444445 | 0 |
| 0.8826388888888889 | 0 |
| 0.8833333333333333 | 0 |
| 0.8840277777777777 | 0 |
| 0.8847222222222223 | 0 |
| 0.8854166666666666 | 0 |
| 0.8861111111111111 | 0 |
| 0.8868055555555556 | 0 |
| 0.8875000000000001 | 0 |
| 0.8881944444444444 | 0 |
| 0.8888888888888888 | 0 |
| 0.8895833333333334 | 0 |
| 0.8902777777777778 | 0 |
| 0.8909722222222222 | 0 |
| 0.8916666666666666 | 0 |
| 0.8923611111111112 | 0 |
| 0.8930555555555556 | 0 |
| 0.8937499999999999 | 0 |
| 0.8944444444444444 | 0 |
| 0.8951388888888889 | 0 |
| 0.8958333333333334 | 0 |
| 0.8965277777777777 | 0 |
| 0.8972222222222223 | 0 |
| 0.8979166666666667 | 0 |
| 0.8986111111111111 | 0 |
| 0.8993055555555555 | 0 |
| 0.9 | 0 |
| 0.9006944444444445 | 0 |
| 0.9013888888888889 | 0 |
| 0.9020833333333332 | 0 |
| 0.9027777777777778 | 0 |
| 0.9034722222222222 | 0 |
| 0.9041666666666667 | 0 |
| 0.904861111111111 | 0 |
| 0.9055555555555556 | 0 |
| 0.90625 | 0 |
| 0.9069444444444444 | 0 |
| 0.907638888888889 | 0 |
| 0.9083333333333333 | 0 |
| 0.9090277777777778 | 0 |
| 0.9097222222222222 | 0 |
| 0.9104166666666668 | 0 |
| 0.9111111111111111 | 0 |
| 0.9118055555555555 | 0 |
| 0.9125 | 0 |
| 0.9131944444444445 | 0 |
| 0.9138888888888889 | 0 |
| 0.9145833333333333 | 0 |
| 0.9152777777777777 | 0 |
| 0.9159722222222223 | 0 |
| 0.9166666666666666 | 0 |
| 0.9173611111111111 | 0 |
| 0.9180555555555556 | 0 |
| 0.9187500000000001 | 0 |
| 0.9194444444444444 | 0 |
| 0.9201388888888888 | 0 |
| 0.9208333333333334 | 0 |
| 0.9215277777777778 | 0 |
| 0.9222222222222222 | 0 |
| 0.9229166666666666 | 0 |
| 0.9236111111111112 | 0 |
| 0.9243055555555556 | 0 |
| 0.9249999999999999 | 0 |
| 0.9256944444444444 | 0 |
| 0.9263888888888889 | 0 |
| 0.9270833333333334 | 0 |
| 0.9277777777777777 | 0 |
| 0.9284722222222223 | 0 |
| 0.9291666666666667 | 0 |
| 0.9298611111111111 | 0 |
| 0.9305555555555555 | 0 |
| 0.93125 | 0 |
| 0.9319444444444445 | 0 |
| 0.9326388888888889 | 0 |
| 0.9333333333333332 | 0 |
| 0.9340277777777778 | 0 |
| 0.9347222222222222 | 0 |
| 0.9354166666666667 | 0 |
| 0.936111111111111 | 0 |
| 0.9368055555555556 | 0 |
| 0.9375 | 0 |
| 0.9381944444444444 | 0 |
| 0.938888888888889 | 0 |
| 0.9395833333333333 | 0 |
| 0.9402777777777778 | 0 |
| 0.9409722222222222 | 0 |
| 0.9416666666666668 | 0 |
| 0.9423611111111111 | 0 |
| 0.9430555555555555 | 0 |
| 0.94375 | 0 |
| 0.9444444444444445 | 0 |
| 0.9451388888888889 | 0 |
| 0.9458333333333333 | 0 |
| 0.9465277777777777 | 0 |
| 0.9472222222222223 | 0 |
| 0.9479166666666666 | 0 |
| 0.9486111111111111 | 0 |
| 0.9493055555555556 | 0 |
| 0.9500000000000001 | 0 |
| 0.9506944444444444 | 0 |
| 0.9513888888888888 | 0 |
| 0.9520833333333334 | 0 |
| 0.9527777777777778 | 0 |
| 0.9534722222222222 | 0 |
| 0.9541666666666666 | 0 |
| 0.9548611111111112 | 0 |
| 0.9555555555555556 | 0 |
| 0.9562499999999999 | 0 |
| 0.9569444444444444 | 0 |
| 0.9576388888888889 | 0 |
| 0.9583333333333334 | 0 |
| 0.9590277777777777 | 0 |
| 0.9597222222222223 | 0 |
| 0.9604166666666667 | 0 |
| 0.9611111111111111 | 0 |
| 0.9618055555555555 | 0 |
| 0.9625 | 0 |
| 0.9631944444444445 | 0 |
| 0.9638888888888889 | 0 |
| 0.9645833333333332 | 0 |
| 0.9652777777777778 | 0 |
| 0.9659722222222222 | 0 |
| 0.9666666666666667 | 0 |
| 0.967361111111111 | 0 |
| 0.9680555555555556 | 0 |
| 0.96875 | 0 |
| 0.9694444444444444 | 0 |
| 0.970138888888889 | 0 |
| 0.9708333333333333 | 0 |
| 0.9715277777777778 | 0 |
| 0.9722222222222222 | 0 |
| 0.9729166666666668 | 0 |
| 0.9736111111111111 | 0 |
| 0.9743055555555555 | 0 |
| 0.975 | 0 |
| 0.9756944444444445 | 0 |
| 0.9763888888888889 | 0 |
| 0.9770833333333333 | 0 |
| 0.9777777777777777 | 0 |
| 0.9784722222222223 | 0 |
| 0.9791666666666666 | 0 |
| 0.9798611111111111 | 0 |
| 0.9805555555555556 | 0 |
| 0.9812500000000001 | 0 |
| 0.9819444444444444 | 0 |
| 0.9826388888888888 | 0 |
| 0.9833333333333334 | 0 |
| 0.9840277777777778 | 0 |
| 0.9847222222222222 | 0 |
| 0.9854166666666666 | 0 |
| 0.9861111111111112 | 0 |
| 0.9868055555555556 | 0 |
| 0.9874999999999999 | 0 |
| 0.9881944444444444 | 0 |
| 0.9888888888888889 | 0 |
| 0.9895833333333334 | 0 |
| 0.9902777777777777 | 0 |
| 0.9909722222222223 | 0 |
| 0.9916666666666667 | 0 |
| 0.9923611111111111 | 0 |
| 0.9930555555555555 | 0 |
| 0.99375 | 0 |
| 0.9944444444444445 | 0 |
| 0.9951388888888889 | 0 |
| 0.9958333333333332 | 0 |
| 0.9965277777777778 | 0 |
| 0.9972222222222222 | 0 |
| 0.9979166666666667 | 0 |
| 0.998611111111111 | 0 |
| 0.9993055555555556 | 0 |